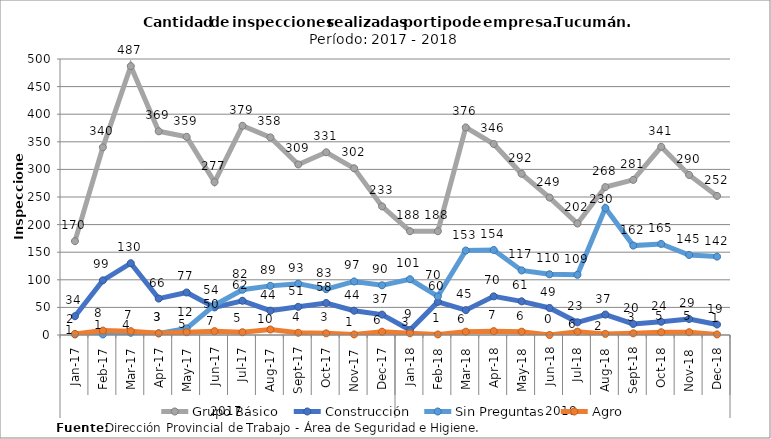
| Category | Grupo Básico | Construcción | Sin Preguntas | Agro |
|---|---|---|---|---|
| 0 | 170 | 34 | 1 | 2 |
| 1 | 340 | 99 | 1 | 8 |
| 2 | 487 | 130 | 4 | 7 |
| 3 | 369 | 66 | 3 | 3 |
| 4 | 359 | 77 | 12 | 5 |
| 5 | 277 | 50 | 54 | 7 |
| 6 | 379 | 62 | 82 | 5 |
| 7 | 358 | 44 | 89 | 10 |
| 8 | 309 | 51 | 93 | 4 |
| 9 | 331 | 58 | 83 | 3 |
| 10 | 302 | 44 | 97 | 1 |
| 11 | 233 | 37 | 90 | 6 |
| 12 | 188 | 9 | 101 | 3 |
| 13 | 188 | 60 | 70 | 1 |
| 14 | 376 | 45 | 153 | 6 |
| 15 | 346 | 70 | 154 | 7 |
| 16 | 292 | 61 | 117 | 6 |
| 17 | 249 | 49 | 110 | 0 |
| 18 | 202 | 23 | 109 | 6 |
| 19 | 268 | 37 | 230 | 2 |
| 20 | 281 | 20 | 162 | 3 |
| 21 | 341 | 24 | 165 | 5 |
| 22 | 290 | 29 | 145 | 5 |
| 23 | 252 | 19 | 142 | 1 |